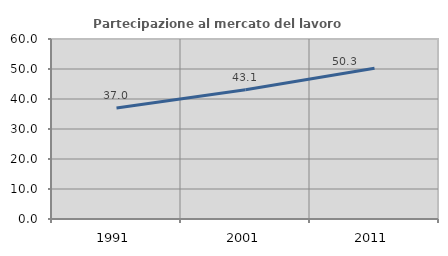
| Category | Partecipazione al mercato del lavoro  femminile |
|---|---|
| 1991.0 | 37 |
| 2001.0 | 43.11 |
| 2011.0 | 50.25 |